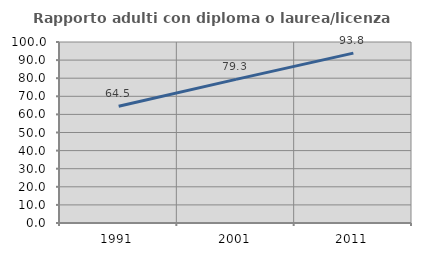
| Category | Rapporto adulti con diploma o laurea/licenza media  |
|---|---|
| 1991.0 | 64.547 |
| 2001.0 | 79.334 |
| 2011.0 | 93.843 |